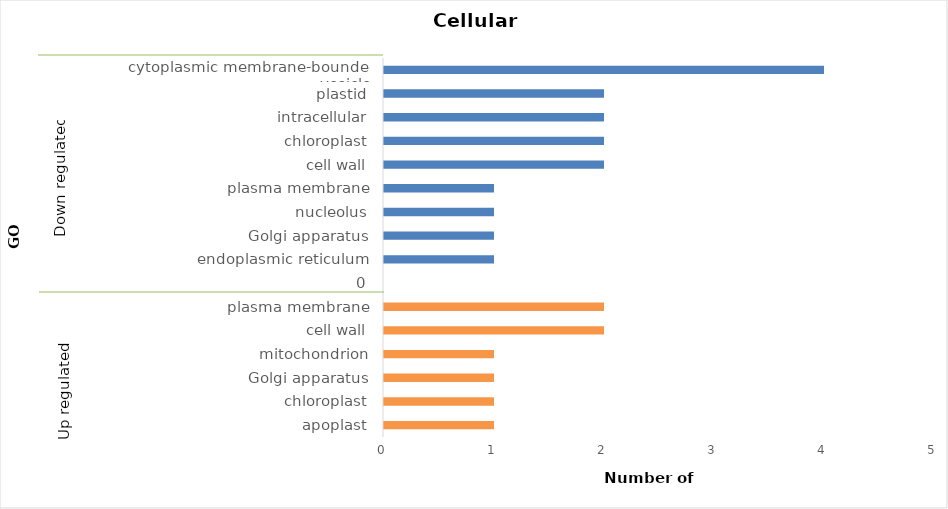
| Category | Upregulated |
|---|---|
| _x0008_apoplast | 1 |
| _x000b_chloroplast | 1 |
| _x000f_Golgi apparatus | 1 |
| _x000d_mitochondrion | 1 |
| 	cell wall | 2 |
| _x000f_plasma membrane | 2 |
| _x0001_0 | 0 |
| _x0015_endoplasmic reticulum | 1 |
| _x000f_Golgi apparatus | 1 |
| 	nucleolus | 1 |
| _x000f_plasma membrane | 1 |
| 	cell wall | 2 |
| _x000b_chloroplast | 2 |
| _x000d_intracellular | 2 |
| _x0007_plastid | 2 |
| $cytoplasmic membrane-bounded vesicle | 4 |